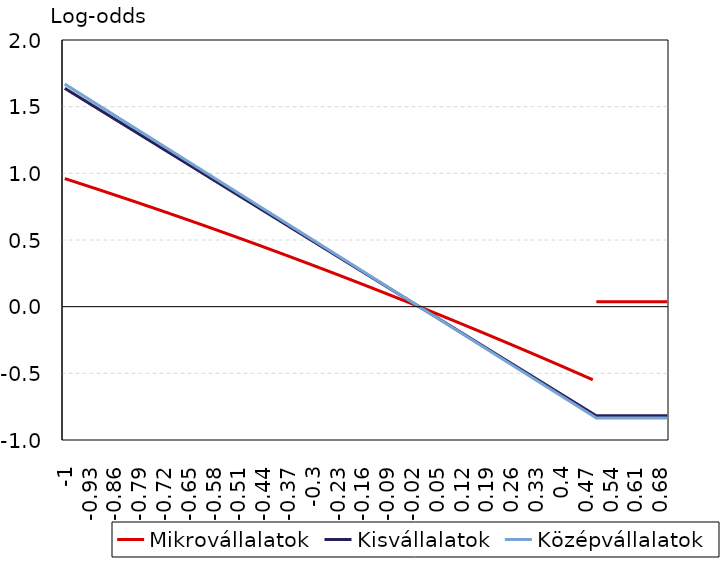
| Category | Mikrovállalatok | Kisvállalatok | Középvállalatok |
|---|---|---|---|
| -1.0 | 0.961 | 1.638 | 1.67 |
| -0.99 | 0.952 | 1.621 | 1.653 |
| -0.98 | 0.943 | 1.605 | 1.636 |
| -0.97 | 0.935 | 1.589 | 1.62 |
| -0.96 | 0.926 | 1.572 | 1.603 |
| -0.95 | 0.918 | 1.556 | 1.586 |
| -0.94 | 0.909 | 1.54 | 1.569 |
| -0.93 | 0.9 | 1.523 | 1.553 |
| -0.92 | 0.892 | 1.507 | 1.536 |
| -0.91 | 0.883 | 1.49 | 1.519 |
| -0.9 | 0.874 | 1.474 | 1.503 |
| -0.89 | 0.865 | 1.458 | 1.486 |
| -0.88 | 0.857 | 1.441 | 1.469 |
| -0.87 | 0.848 | 1.425 | 1.453 |
| -0.86 | 0.839 | 1.408 | 1.436 |
| -0.85 | 0.83 | 1.392 | 1.419 |
| -0.84 | 0.821 | 1.376 | 1.403 |
| -0.83 | 0.812 | 1.359 | 1.386 |
| -0.82 | 0.803 | 1.343 | 1.369 |
| -0.81 | 0.794 | 1.327 | 1.352 |
| -0.8 | 0.785 | 1.31 | 1.336 |
| -0.79 | 0.776 | 1.294 | 1.319 |
| -0.78 | 0.767 | 1.277 | 1.302 |
| -0.77 | 0.758 | 1.261 | 1.286 |
| -0.76 | 0.749 | 1.245 | 1.269 |
| -0.75 | 0.74 | 1.228 | 1.252 |
| -0.74 | 0.731 | 1.212 | 1.236 |
| -0.73 | 0.722 | 1.196 | 1.219 |
| -0.72 | 0.713 | 1.179 | 1.202 |
| -0.71 | 0.704 | 1.163 | 1.185 |
| -0.7 | 0.695 | 1.146 | 1.169 |
| -0.69 | 0.686 | 1.13 | 1.152 |
| -0.68 | 0.676 | 1.114 | 1.135 |
| -0.67 | 0.667 | 1.097 | 1.119 |
| -0.66 | 0.658 | 1.081 | 1.102 |
| -0.65 | 0.649 | 1.065 | 1.085 |
| -0.64 | 0.639 | 1.048 | 1.069 |
| -0.63 | 0.63 | 1.032 | 1.052 |
| -0.62 | 0.621 | 1.015 | 1.035 |
| -0.61 | 0.611 | 0.999 | 1.019 |
| -0.6 | 0.602 | 0.983 | 1.002 |
| -0.59 | 0.592 | 0.966 | 0.985 |
| -0.58 | 0.583 | 0.95 | 0.968 |
| -0.57 | 0.574 | 0.934 | 0.952 |
| -0.56 | 0.564 | 0.917 | 0.935 |
| -0.55 | 0.555 | 0.901 | 0.918 |
| -0.54 | 0.545 | 0.884 | 0.902 |
| -0.53 | 0.536 | 0.868 | 0.885 |
| -0.52 | 0.526 | 0.852 | 0.868 |
| -0.51 | 0.516 | 0.835 | 0.852 |
| -0.5 | 0.507 | 0.819 | 0.835 |
| -0.49 | 0.497 | 0.803 | 0.818 |
| -0.48 | 0.488 | 0.786 | 0.801 |
| -0.47 | 0.478 | 0.77 | 0.785 |
| -0.46 | 0.468 | 0.753 | 0.768 |
| -0.45 | 0.459 | 0.737 | 0.751 |
| -0.44 | 0.449 | 0.721 | 0.735 |
| -0.429999999999999 | 0.439 | 0.704 | 0.718 |
| -0.419999999999999 | 0.429 | 0.688 | 0.701 |
| -0.409999999999999 | 0.42 | 0.671 | 0.685 |
| -0.399999999999999 | 0.41 | 0.655 | 0.668 |
| -0.389999999999999 | 0.4 | 0.639 | 0.651 |
| -0.379999999999999 | 0.39 | 0.622 | 0.634 |
| -0.369999999999999 | 0.38 | 0.606 | 0.618 |
| -0.359999999999999 | 0.37 | 0.59 | 0.601 |
| -0.349999999999999 | 0.36 | 0.573 | 0.584 |
| -0.339999999999999 | 0.35 | 0.557 | 0.568 |
| -0.329999999999999 | 0.34 | 0.54 | 0.551 |
| -0.319999999999999 | 0.331 | 0.524 | 0.534 |
| -0.309999999999999 | 0.321 | 0.508 | 0.518 |
| -0.299999999999999 | 0.31 | 0.491 | 0.501 |
| -0.289999999999999 | 0.3 | 0.475 | 0.484 |
| -0.279999999999999 | 0.29 | 0.459 | 0.468 |
| -0.269999999999999 | 0.28 | 0.442 | 0.451 |
| -0.259999999999999 | 0.27 | 0.426 | 0.434 |
| -0.249999999999999 | 0.26 | 0.409 | 0.417 |
| -0.239999999999999 | 0.25 | 0.393 | 0.401 |
| -0.229999999999999 | 0.24 | 0.377 | 0.384 |
| -0.219999999999999 | 0.23 | 0.36 | 0.367 |
| -0.209999999999999 | 0.219 | 0.344 | 0.351 |
| -0.199999999999999 | 0.209 | 0.328 | 0.334 |
| -0.189999999999999 | 0.199 | 0.311 | 0.317 |
| -0.179999999999999 | 0.189 | 0.295 | 0.301 |
| -0.169999999999999 | 0.178 | 0.278 | 0.284 |
| -0.159999999999999 | 0.168 | 0.262 | 0.267 |
| -0.149999999999999 | 0.158 | 0.246 | 0.25 |
| -0.139999999999999 | 0.147 | 0.229 | 0.234 |
| -0.129999999999999 | 0.137 | 0.213 | 0.217 |
| -0.119999999999999 | 0.126 | 0.197 | 0.2 |
| -0.109999999999999 | 0.116 | 0.18 | 0.184 |
| -0.099999999999999 | 0.106 | 0.164 | 0.167 |
| -0.089999999999999 | 0.095 | 0.147 | 0.15 |
| -0.079999999999999 | 0.085 | 0.131 | 0.134 |
| -0.069999999999999 | 0.074 | 0.115 | 0.117 |
| -0.0599999999999991 | 0.064 | 0.098 | 0.1 |
| -0.049999999999999 | 0.053 | 0.082 | 0.083 |
| -0.039999999999999 | 0.043 | 0.066 | 0.067 |
| -0.029999999999999 | 0.032 | 0.049 | 0.05 |
| -0.019999999999999 | 0.021 | 0.033 | 0.033 |
| -0.00999999999999901 | 0.011 | 0.016 | 0.017 |
| 0.0 | 0 | 0 | 0 |
| 0.01 | -0.011 | -0.016 | -0.017 |
| 0.02 | -0.021 | -0.033 | -0.033 |
| 0.03 | -0.032 | -0.049 | -0.05 |
| 0.04 | -0.043 | -0.066 | -0.067 |
| 0.05 | -0.054 | -0.082 | -0.083 |
| 0.0600000000000001 | -0.064 | -0.098 | -0.1 |
| 0.0700000000000001 | -0.075 | -0.115 | -0.117 |
| 0.0800000000000001 | -0.086 | -0.131 | -0.134 |
| 0.0900000000000001 | -0.097 | -0.147 | -0.15 |
| 0.1 | -0.108 | -0.164 | -0.167 |
| 0.11 | -0.119 | -0.18 | -0.184 |
| 0.12 | -0.13 | -0.197 | -0.2 |
| 0.13 | -0.14 | -0.213 | -0.217 |
| 0.14 | -0.151 | -0.229 | -0.234 |
| 0.15 | -0.162 | -0.246 | -0.25 |
| 0.16 | -0.173 | -0.262 | -0.267 |
| 0.17 | -0.184 | -0.278 | -0.284 |
| 0.18 | -0.195 | -0.295 | -0.301 |
| 0.19 | -0.207 | -0.311 | -0.317 |
| 0.2 | -0.218 | -0.328 | -0.334 |
| 0.21 | -0.229 | -0.344 | -0.351 |
| 0.22 | -0.24 | -0.36 | -0.367 |
| 0.23 | -0.251 | -0.377 | -0.384 |
| 0.24 | -0.262 | -0.393 | -0.401 |
| 0.25 | -0.273 | -0.409 | -0.417 |
| 0.26 | -0.285 | -0.426 | -0.434 |
| 0.27 | -0.296 | -0.442 | -0.451 |
| 0.28 | -0.307 | -0.459 | -0.468 |
| 0.29 | -0.318 | -0.475 | -0.484 |
| 0.3 | -0.33 | -0.491 | -0.501 |
| 0.31 | -0.341 | -0.508 | -0.518 |
| 0.32 | -0.352 | -0.524 | -0.534 |
| 0.33 | -0.364 | -0.54 | -0.551 |
| 0.34 | -0.375 | -0.557 | -0.568 |
| 0.35 | -0.386 | -0.573 | -0.584 |
| 0.36 | -0.398 | -0.59 | -0.601 |
| 0.37 | -0.409 | -0.606 | -0.618 |
| 0.38 | -0.421 | -0.622 | -0.634 |
| 0.39 | -0.432 | -0.639 | -0.651 |
| 0.4 | -0.444 | -0.655 | -0.668 |
| 0.41 | -0.455 | -0.671 | -0.685 |
| 0.42 | -0.467 | -0.688 | -0.701 |
| 0.43 | -0.478 | -0.704 | -0.718 |
| 0.44 | -0.49 | -0.721 | -0.735 |
| 0.45 | -0.502 | -0.737 | -0.751 |
| 0.46 | -0.513 | -0.753 | -0.768 |
| 0.47 | -0.525 | -0.77 | -0.785 |
| 0.48 | -0.537 | -0.786 | -0.801 |
| 0.49 | -0.548 | -0.803 | -0.818 |
| 0.5 | 0.037 | -0.819 | -0.835 |
| 0.51 | 0.037 | -0.819 | -0.835 |
| 0.52 | 0.037 | -0.819 | -0.835 |
| 0.53 | 0.037 | -0.819 | -0.835 |
| 0.54 | 0.037 | -0.819 | -0.835 |
| 0.55 | 0.037 | -0.819 | -0.835 |
| 0.56 | 0.037 | -0.819 | -0.835 |
| 0.57 | 0.037 | -0.819 | -0.835 |
| 0.58 | 0.037 | -0.819 | -0.835 |
| 0.59 | 0.037 | -0.819 | -0.835 |
| 0.6 | 0.037 | -0.819 | -0.835 |
| 0.61 | 0.037 | -0.819 | -0.835 |
| 0.62 | 0.037 | -0.819 | -0.835 |
| 0.63 | 0.037 | -0.819 | -0.835 |
| 0.64 | 0.037 | -0.819 | -0.835 |
| 0.65 | 0.037 | -0.819 | -0.835 |
| 0.66 | 0.037 | -0.819 | -0.835 |
| 0.67 | 0.037 | -0.819 | -0.835 |
| 0.68 | 0.037 | -0.819 | -0.835 |
| 0.69 | 0.037 | -0.819 | -0.835 |
| 0.7 | 0.037 | -0.819 | -0.835 |